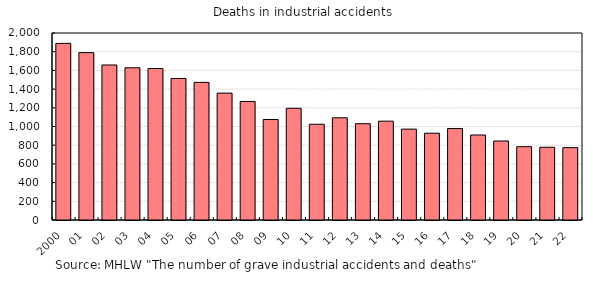
| Category | Series 0 |
|---|---|
| 2000 | 1889 |
| 01 | 1790 |
| 02 | 1658 |
| 03 | 1628 |
| 04 | 1620 |
| 05 | 1514 |
| 06 | 1472 |
| 07 | 1357 |
| 08 | 1268 |
| 09 | 1075 |
| 10 | 1195 |
| 11 | 1024 |
| 12 | 1093 |
| 13 | 1030 |
| 14 | 1057 |
| 15 | 972 |
| 16 | 928 |
| 17 | 978 |
| 18 | 909 |
| 19 | 845 |
| 20 | 784 |
| 21 | 778 |
| 22 | 774 |